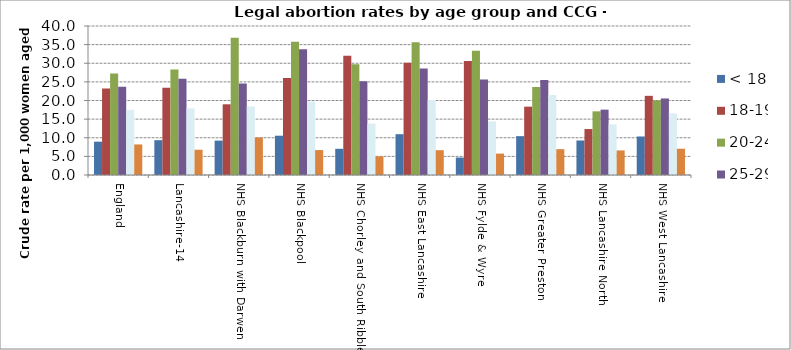
| Category | < 18 | 18-19 | 20-24 | 25-29 | 30-34 | 35+ |
|---|---|---|---|---|---|---|
| England  | 8.948 | 23.196 | 27.23 | 23.671 | 17.474 | 8.205 |
| Lancashire-14 | 9.347 | 23.42 | 28.347 | 25.851 | 17.89 | 6.782 |
| NHS Blackburn with Darwen | 9.228 | 18.98 | 36.84 | 24.569 | 18.423 | 10.071 |
| NHS Blackpool | 10.548 | 26.071 | 35.782 | 33.756 | 19.719 | 6.695 |
| NHS Chorley and South Ribble | 7.032 | 32.04 | 29.725 | 25.162 | 13.801 | 4.999 |
| NHS East Lancashire | 10.954 | 30.131 | 35.65 | 28.612 | 20.138 | 6.658 |
| NHS Fylde & Wyre | 4.686 | 30.605 | 33.379 | 25.647 | 14.381 | 5.745 |
| NHS Greater Preston | 10.429 | 18.345 | 23.646 | 25.489 | 21.477 | 6.933 |
| NHS Lancashire North | 9.27 | 12.337 | 17.092 | 17.544 | 13.583 | 6.595 |
| NHS West Lancashire | 10.341 | 21.255 | 20.041 | 20.55 | 16.568 | 7.055 |